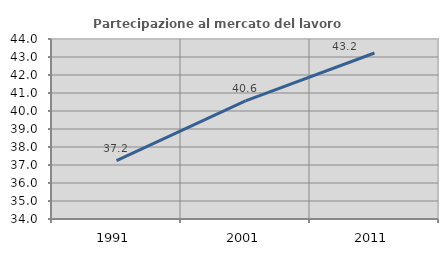
| Category | Partecipazione al mercato del lavoro  femminile |
|---|---|
| 1991.0 | 37.243 |
| 2001.0 | 40.566 |
| 2011.0 | 43.221 |